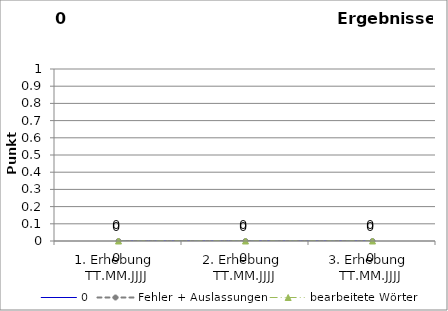
| Category | 0 | Fehler + Auslassungen | bearbeitete Wörter |
|---|---|---|---|
| 1. Erhebung 
TT.MM.JJJJ | 0 | 0 | 0 |
| 2. Erhebung 
TT.MM.JJJJ | 0 | 0 | 0 |
| 3. Erhebung 
TT.MM.JJJJ | 0 | 0 | 0 |